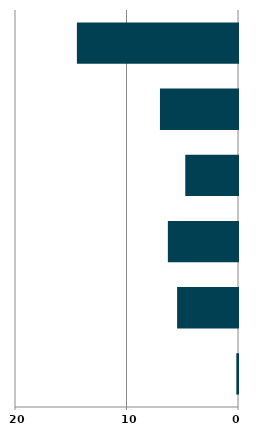
| Category | Series 0 |
|---|---|
| 0 | 0.151 |
| 1 | 5.461 |
| 2 | 6.291 |
| 3 | 4.728 |
| 4 | 7 |
| 5 | 14.448 |